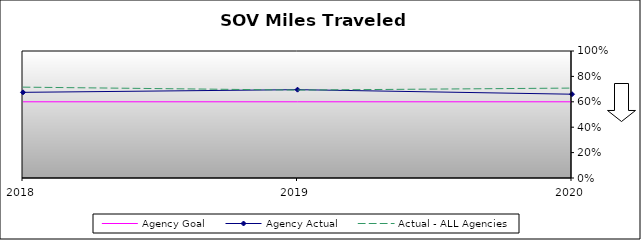
| Category | Agency Goal | Agency Actual | Actual - ALL Agencies |
|---|---|---|---|
| 2018.0 | 0.6 | 0.674 | 0.715 |
| 2019.0 | 0.6 | 0.696 | 0.692 |
| 2020.0 | 0.6 | 0.66 | 0.708 |